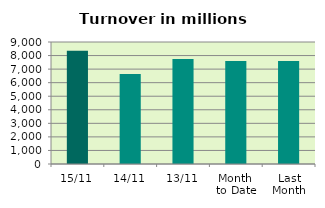
| Category | Series 0 |
|---|---|
| 15/11 | 8350.704 |
| 14/11 | 6643.19 |
| 13/11 | 7736.875 |
| Month 
to Date | 7603.326 |
| Last
Month | 7601.18 |